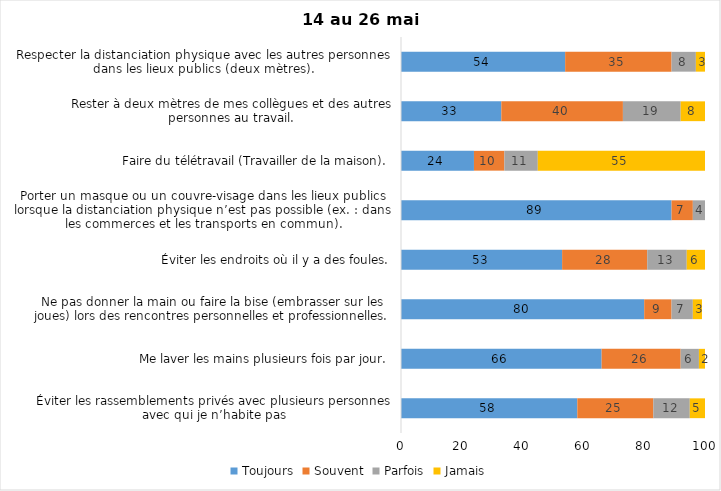
| Category | Toujours | Souvent | Parfois | Jamais |
|---|---|---|---|---|
| Éviter les rassemblements privés avec plusieurs personnes avec qui je n’habite pas | 58 | 25 | 12 | 5 |
| Me laver les mains plusieurs fois par jour. | 66 | 26 | 6 | 2 |
| Ne pas donner la main ou faire la bise (embrasser sur les joues) lors des rencontres personnelles et professionnelles. | 80 | 9 | 7 | 3 |
| Éviter les endroits où il y a des foules. | 53 | 28 | 13 | 6 |
| Porter un masque ou un couvre-visage dans les lieux publics lorsque la distanciation physique n’est pas possible (ex. : dans les commerces et les transports en commun). | 89 | 7 | 4 | 0 |
| Faire du télétravail (Travailler de la maison). | 24 | 10 | 11 | 55 |
| Rester à deux mètres de mes collègues et des autres personnes au travail. | 33 | 40 | 19 | 8 |
| Respecter la distanciation physique avec les autres personnes dans les lieux publics (deux mètres). | 54 | 35 | 8 | 3 |